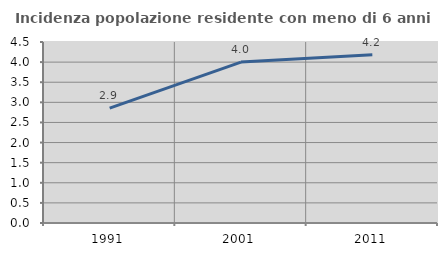
| Category | Incidenza popolazione residente con meno di 6 anni |
|---|---|
| 1991.0 | 2.857 |
| 2001.0 | 4 |
| 2011.0 | 4.182 |